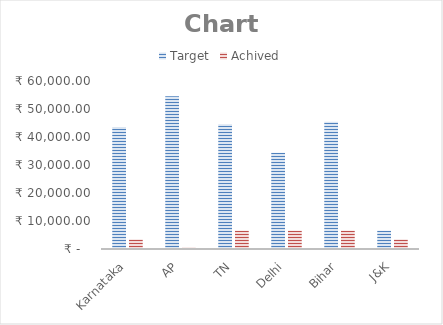
| Category | Target | Achived |
|---|---|---|
| Karnataka | 43545 | 3434 |
| AP | 54545 | 555 |
| TN | 44545 | 6565 |
| Delhi | 34344 | 6566 |
| Bihar | 45454 | 6565 |
| J&K | 6556 | 3434 |